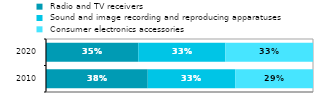
| Category |  Radio and TV receivers |  Sound and image recording and reproducing apparatuses |  Consumer electronics accessories |
|---|---|---|---|
| 2010 | 0.381 | 0.328 | 0.291 |
| 2020 | 0.346 | 0.326 | 0.328 |